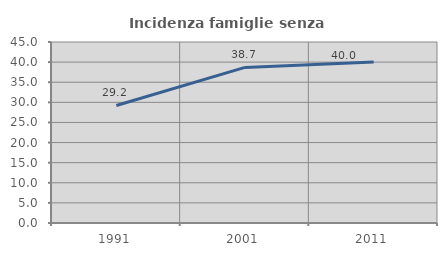
| Category | Incidenza famiglie senza nuclei |
|---|---|
| 1991.0 | 29.213 |
| 2001.0 | 38.69 |
| 2011.0 | 40 |